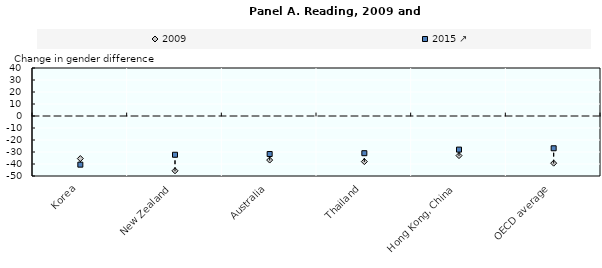
| Category | 2009 | 2015 ↗ |
|---|---|---|
| Korea | -35.479 | -40.54 |
| New Zealand | -45.651 | -32.294 |
| Australia | -36.71 | -31.68 |
| Thailand | -38 | -31 |
| Hong Kong, China | -33 | -28 |
| OECD average | -39.298 | -26.895 |